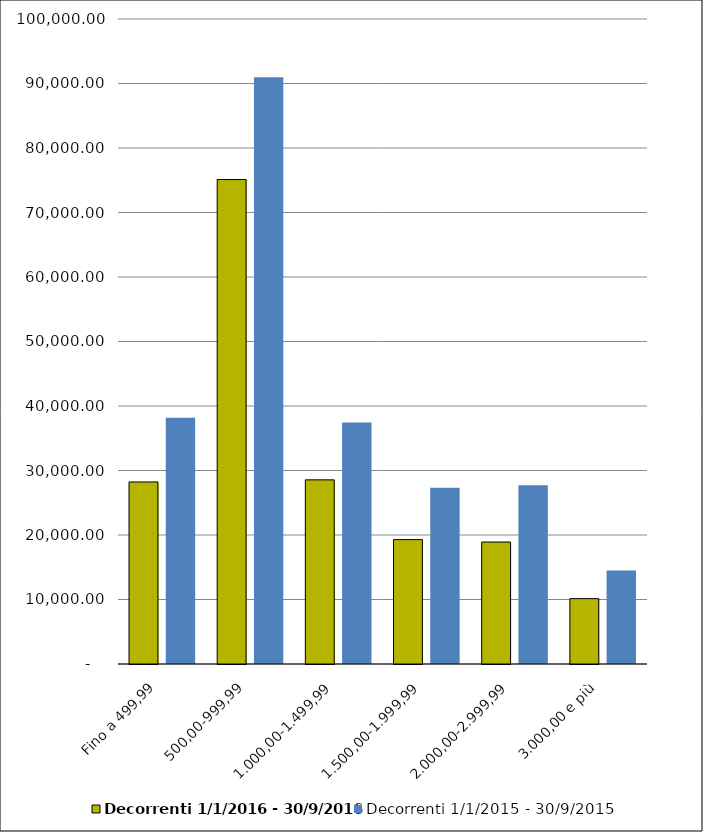
| Category | Decorrenti 1/1/2016 - 30/9/2016 | Decorrenti 1/1/2015 - 30/9/2015 |
|---|---|---|
| Fino a 499,99 | 28225 | 38176 |
| 500,00-999,99 | 75114 | 90972 |
| 1.000,00-1.499,99 | 28551 | 37439 |
| 1.500,00-1.999,99 | 19287 | 27325 |
| 2.000,00-2.999,99 | 18912 | 27717 |
| 3.000,00 e più | 10132 | 14505 |